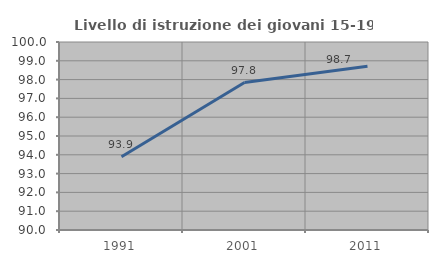
| Category | Livello di istruzione dei giovani 15-19 anni |
|---|---|
| 1991.0 | 93.896 |
| 2001.0 | 97.843 |
| 2011.0 | 98.708 |